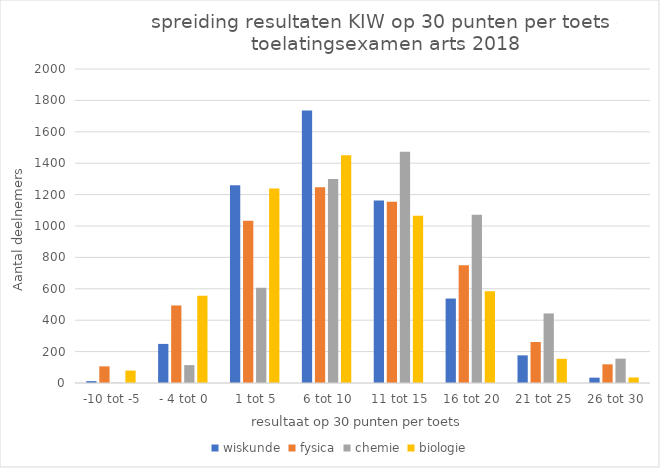
| Category | wiskunde | fysica | chemie | biologie |
|---|---|---|---|---|
|  -10 tot -5 | 12 | 106 | 2 | 79 |
|  - 4 tot 0 | 249 | 494 | 114 | 556 |
|  1 tot 5 | 1259 | 1033 | 607 | 1239 |
|  6 tot 10 | 1735 | 1247 | 1300 | 1451 |
|  11 tot 15 | 1162 | 1155 | 1473 | 1066 |
|  16 tot 20 | 538 | 750 | 1071 | 585 |
|  21 tot 25 | 176 | 261 | 443 | 154 |
|  26 tot 30 | 34 | 119 | 155 | 35 |